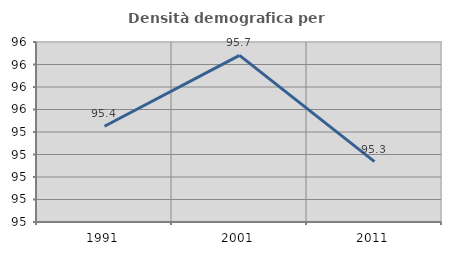
| Category | Densità demografica |
|---|---|
| 1991.0 | 95.426 |
| 2001.0 | 95.74 |
| 2011.0 | 95.268 |